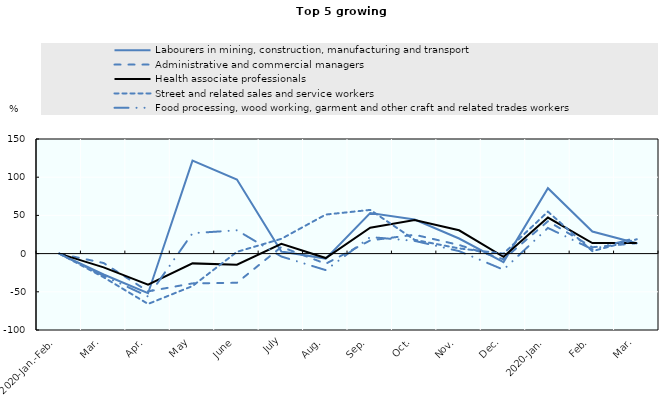
| Category | Labourers in mining, construction, manufacturing and transport | Administrative and commercial managers | Health associate professionals | Street and related sales and service workers | Food processing, wood working, garment and other craft and related trades workers |
|---|---|---|---|---|---|
| 2020-Jan.-Feb. | 0 | 0 | 0 | 0 | 0 |
| Mar. | -27.325 | -12.335 | -17.987 | -30.98 | -29.099 |
| Apr. | -51.878 | -49.449 | -40.754 | -65.903 | -56.12 |
| May | 121.663 | -38.982 | -12.796 | -42.471 | 26.706 |
| June | 97.008 | -38.226 | -14.545 | 2.291 | 30.492 |
| July | 2.657 | 8.713 | 12.76 | 19.339 | -3.822 |
| Aug. | -6.533 | -13.262 | -5.808 | 51.108 | -21.627 |
| Sep. | 53.173 | 17.261 | 33.877 | 57.191 | 21.661 |
| Oct. | 44.611 | 24.672 | 43.836 | 17.987 | 16.652 |
| Nov. | 19.765 | 11.307 | 30.539 | 6.797 | 3.264 |
| Dec. | -11.113 | -7.449 | -4.22 | -0.038 | -21.058 |
| 2020-Jan. | 85.588 | 42.345 | 47.146 | 54.938 | 33.569 |
| Feb. | 28.897 | 8.305 | 13.825 | 3.192 | 5.652 |
| Mar. | 13.45 | 13.559 | 13.916 | 18.738 | 20.814 |